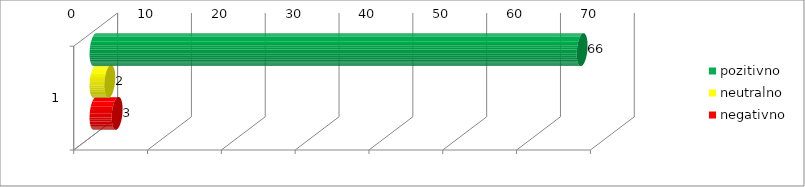
| Category | pozitivno | neutralno | negativno |
|---|---|---|---|
| 0 | 66 | 2 | 3 |